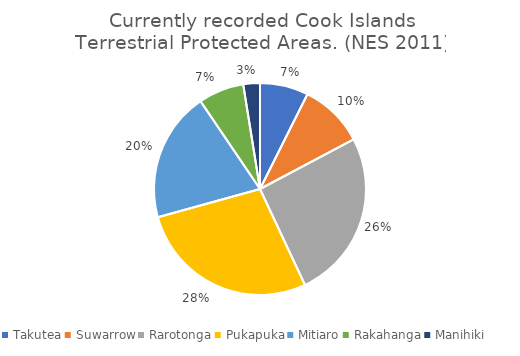
| Category | Series 0 | Series 1 |
|---|---|---|
| Takutea |  | 0.074 |
| Suwarrow |  | 0.098 |
| Rarotonga |  | 0.258 |
| Pukapuka |  | 0.277 |
| Mitiaro |  | 0.198 |
| Rakahanga |  | 0.069 |
| Manihiki |  | 0.025 |